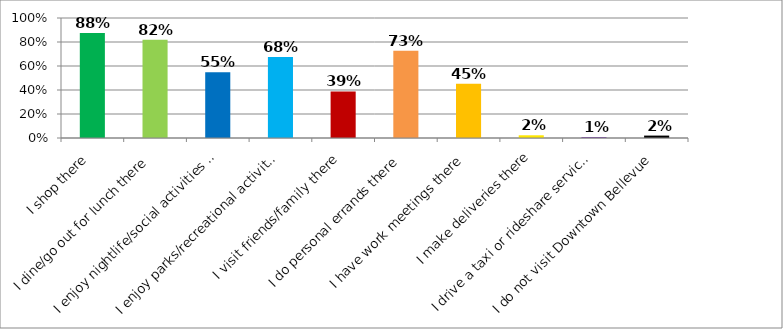
| Category | Responses |
|---|---|
| I shop there | 0.875 |
| I dine/go out for lunch there | 0.818 |
| I enjoy nightlife/social activities there | 0.549 |
| I enjoy parks/recreational activities there | 0.675 |
| I visit friends/family there | 0.388 |
| I do personal errands there | 0.728 |
| I have work meetings there | 0.452 |
| I make deliveries there | 0.023 |
| I drive a taxi or rideshare service there | 0.008 |
| I do not visit Downtown Bellevue | 0.02 |